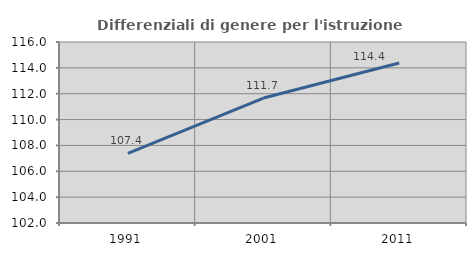
| Category | Differenziali di genere per l'istruzione superiore |
|---|---|
| 1991.0 | 107.389 |
| 2001.0 | 111.664 |
| 2011.0 | 114.373 |